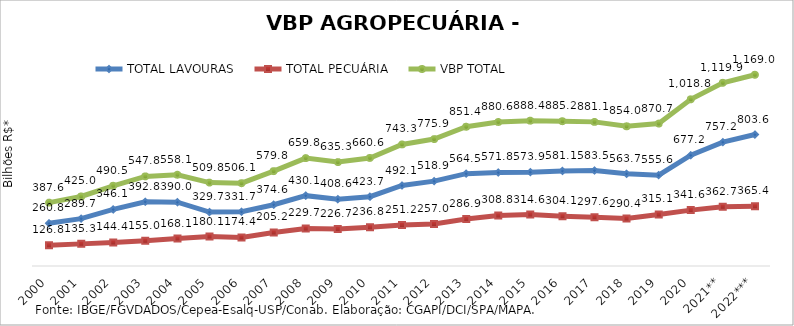
| Category | TOTAL LAVOURAS | TOTAL PECUÁRIA | VBP TOTAL |
|---|---|---|---|
| 2000 | 260.84 | 126.792 | 387.632 |
| 2001 | 289.745 | 135.271 | 425.016 |
| 2002 | 346.111 | 144.402 | 490.513 |
| 2003 | 392.833 | 154.991 | 547.824 |
| 2004 | 389.957 | 168.121 | 558.077 |
| 2005 | 329.691 | 180.098 | 509.789 |
| 2006 | 331.705 | 174.427 | 506.132 |
| 2007 | 374.6 | 205.204 | 579.804 |
| 2008 | 430.134 | 229.672 | 659.806 |
| 2009 | 408.57 | 226.685 | 635.255 |
| 2010 | 423.732 | 236.842 | 660.574 |
| 2011 | 492.113 | 251.228 | 743.341 |
| 2012 | 518.873 | 256.992 | 775.865 |
| 2013 | 564.537 | 286.9 | 851.437 |
| 2014 | 571.8 | 308.786 | 880.587 |
| 2015 | 573.875 | 314.569 | 888.444 |
| 2016 | 581.132 | 304.109 | 885.241 |
| 2017 | 583.545 | 297.575 | 881.12 |
| 2018 | 563.671 | 290.378 | 854.05 |
| 2019 | 555.566 | 315.144 | 870.709 |
| 2020 | 677.247 | 341.596 | 1018.843 |
| 2021** | 757.227 | 362.719 | 1119.947 |
| 2022*** | 803.586 | 365.44 | 1169.026 |